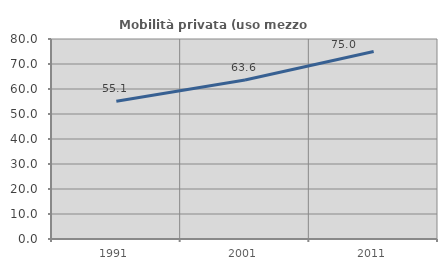
| Category | Mobilità privata (uso mezzo privato) |
|---|---|
| 1991.0 | 55.058 |
| 2001.0 | 63.58 |
| 2011.0 | 74.986 |